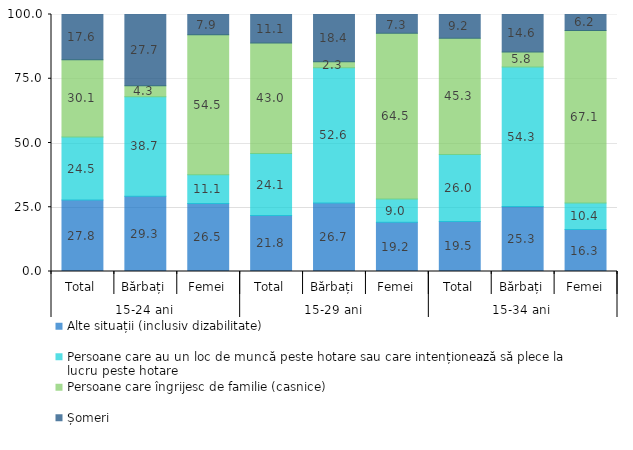
| Category | Alte situații (inclusiv dizabilitate) | Persoane care au un loc de muncă peste hotare sau care intenționează să plece la lucru peste hotare | Persoane care îngrijesc de familie (casnice) | Șomeri |
|---|---|---|---|---|
| 0 | 27.8 | 24.5 | 30.1 | 17.6 |
| 1 | 29.3 | 38.7 | 4.3 | 27.7 |
| 2 | 26.5 | 11.1 | 54.5 | 7.9 |
| 3 | 21.8 | 24.1 | 43 | 11.1 |
| 4 | 26.7 | 52.6 | 2.3 | 18.4 |
| 5 | 19.2 | 9 | 64.5 | 7.3 |
| 6 | 19.5 | 26 | 45.3 | 9.2 |
| 7 | 25.3 | 54.3 | 5.8 | 14.6 |
| 8 | 16.3 | 10.4 | 67.1 | 6.2 |